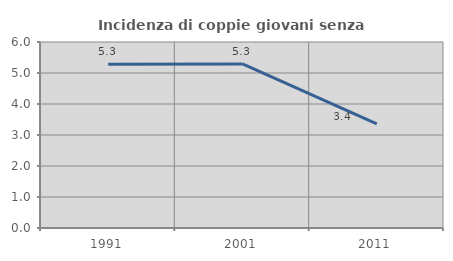
| Category | Incidenza di coppie giovani senza figli |
|---|---|
| 1991.0 | 5.284 |
| 2001.0 | 5.292 |
| 2011.0 | 3.357 |